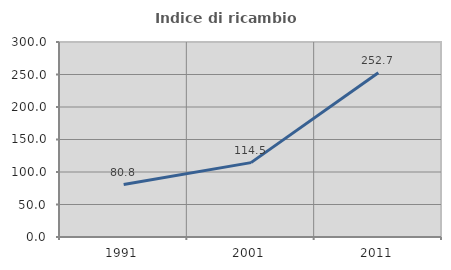
| Category | Indice di ricambio occupazionale  |
|---|---|
| 1991.0 | 80.756 |
| 2001.0 | 114.453 |
| 2011.0 | 252.695 |